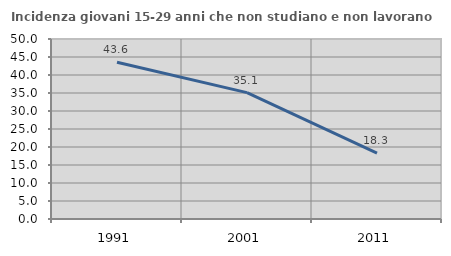
| Category | Incidenza giovani 15-29 anni che non studiano e non lavorano  |
|---|---|
| 1991.0 | 43.559 |
| 2001.0 | 35.115 |
| 2011.0 | 18.293 |